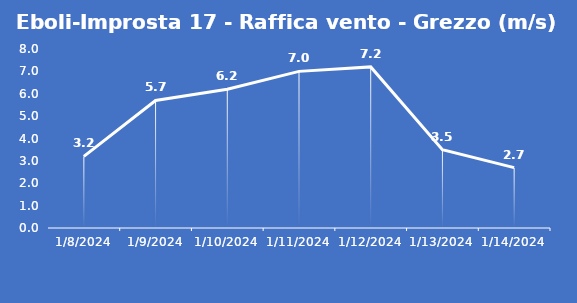
| Category | Eboli-Improsta 17 - Raffica vento - Grezzo (m/s) |
|---|---|
| 1/8/24 | 3.2 |
| 1/9/24 | 5.7 |
| 1/10/24 | 6.2 |
| 1/11/24 | 7 |
| 1/12/24 | 7.2 |
| 1/13/24 | 3.5 |
| 1/14/24 | 2.7 |